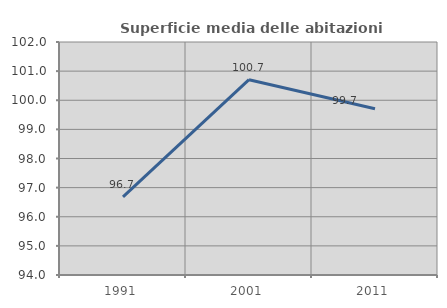
| Category | Superficie media delle abitazioni occupate |
|---|---|
| 1991.0 | 96.681 |
| 2001.0 | 100.706 |
| 2011.0 | 99.707 |